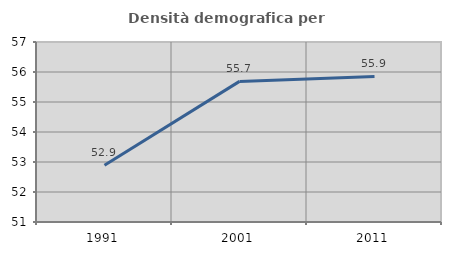
| Category | Densità demografica |
|---|---|
| 1991.0 | 52.894 |
| 2001.0 | 55.687 |
| 2011.0 | 55.851 |